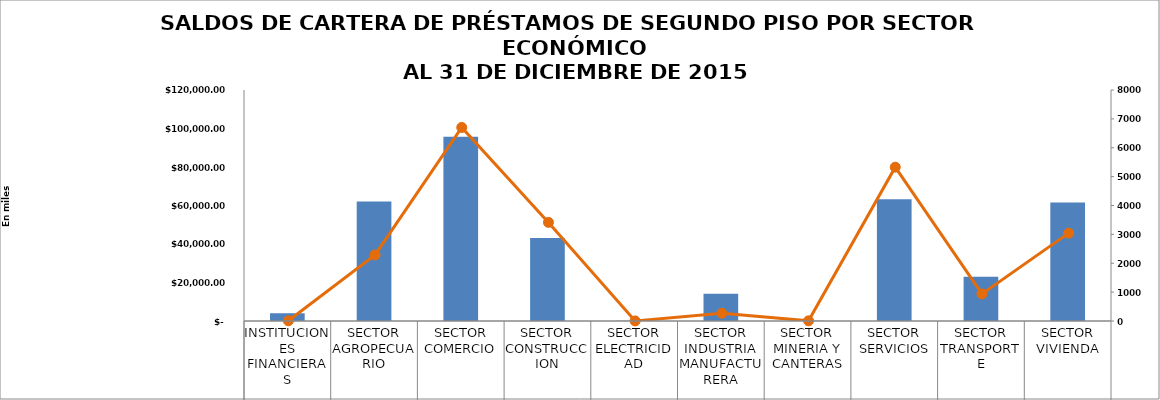
| Category |  Saldo del Crédito en Miles US$ |
|---|---|
| INSTITUCIONES FINANCIERAS | 3967.895 |
| SECTOR AGROPECUARIO | 62093.986 |
| SECTOR COMERCIO | 95714.767 |
| SECTOR CONSTRUCCION | 43172.227 |
| SECTOR ELECTRICIDAD | 71.684 |
| SECTOR INDUSTRIA MANUFACTURERA | 14194.35 |
| SECTOR MINERIA Y CANTERAS | 186.383 |
| SECTOR SERVICIOS | 63266.981 |
| SECTOR TRANSPORTE | 23013.401 |
| SECTOR VIVIENDA | 61548.038 |